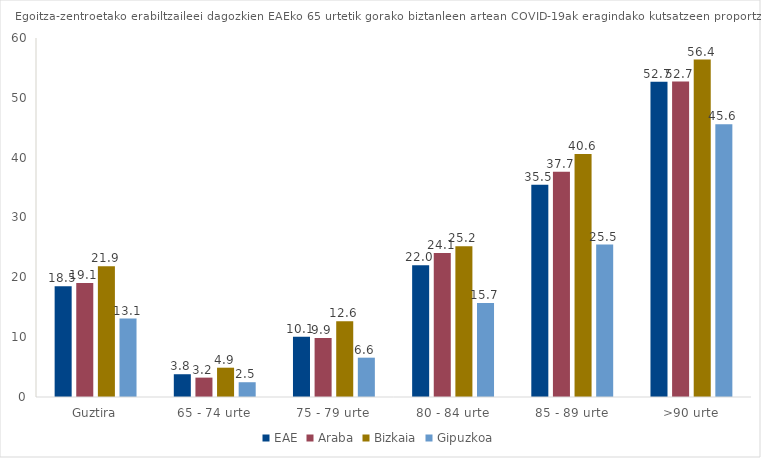
| Category | EAE | Araba | Bizkaia | Gipuzkoa |
|---|---|---|---|---|
| Guztira | 18.518 | 19.051 | 21.85 | 13.107 |
| 65 - 74 urte | 3.805 | 3.238 | 4.897 | 2.469 |
| 75 - 79 urte | 10.061 | 9.858 | 12.646 | 6.572 |
| 80 - 84 urte | 22.013 | 24.052 | 25.202 | 15.718 |
| 85 - 89 urte | 35.47 | 37.665 | 40.632 | 25.467 |
| >90 urte | 52.698 | 52.715 | 56.405 | 45.6 |